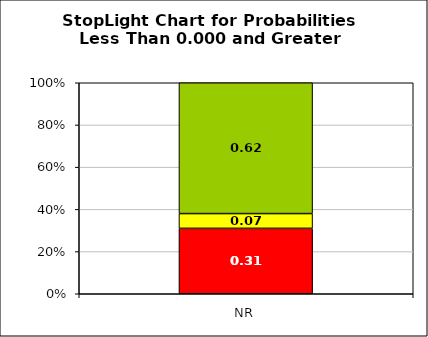
| Category | Series 0 | Series 1 | Series 2 |
|---|---|---|---|
| NR | 0.31 | 0.07 | 0.62 |